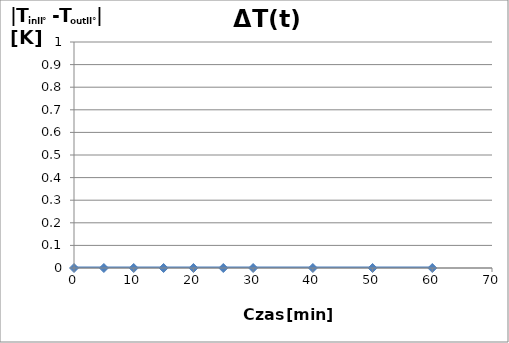
| Category | Series 0 |
|---|---|
| 0.0 | 0 |
| 5.0 | 0 |
| 10.0 | 0 |
| 15.0 | 0 |
| 20.0 | 0 |
| 25.0 | 0 |
| 30.0 | 0 |
| 40.0 | 0 |
| 50.0 | 0 |
| 60.0 | 0 |